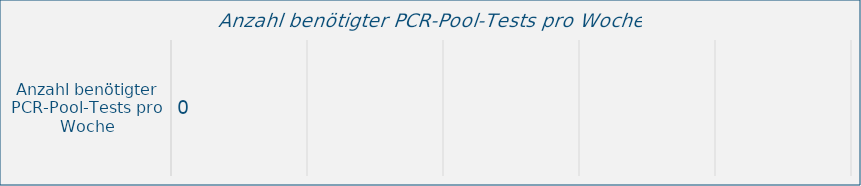
| Category | Series 0 |
|---|---|
| Anzahl benötigter PCR-Pool-Tests pro Woche | 0 |